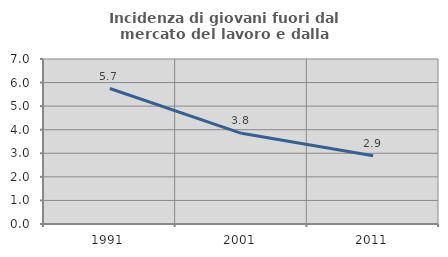
| Category | Incidenza di giovani fuori dal mercato del lavoro e dalla formazione  |
|---|---|
| 1991.0 | 5.747 |
| 2001.0 | 3.846 |
| 2011.0 | 2.899 |